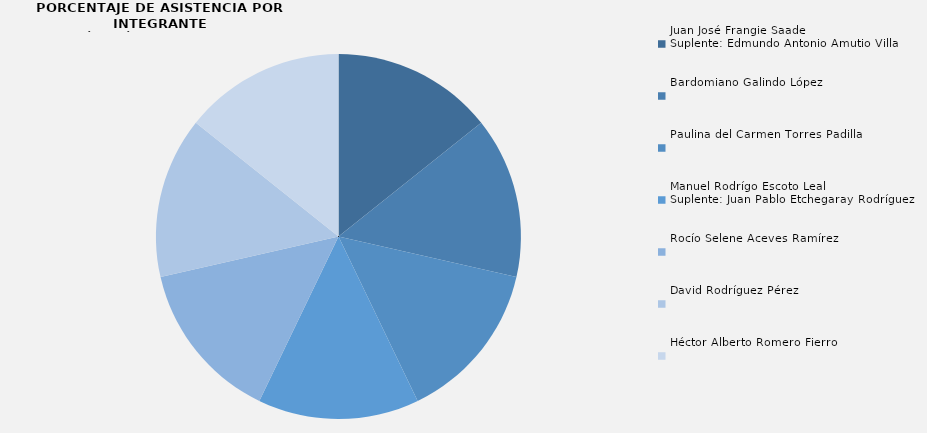
| Category | Juan José Frangie Saade
Suplente: Edmundo Antonio Amutio Villa          |
|---|---|
| Juan José Frangie Saade
Suplente: Edmundo Antonio Amutio Villa          | 1 |
| Bardomiano Galindo López | 1 |
| Paulina del Carmen Torres Padilla | 1 |
| Manuel Rodrígo Escoto Leal
Suplente: Juan Pablo Etchegaray Rodríguez  | 1 |
| Rocío Selene Aceves Ramírez | 1 |
| David Rodríguez Pérez | 1 |
| Héctor Alberto Romero Fierro | 1 |